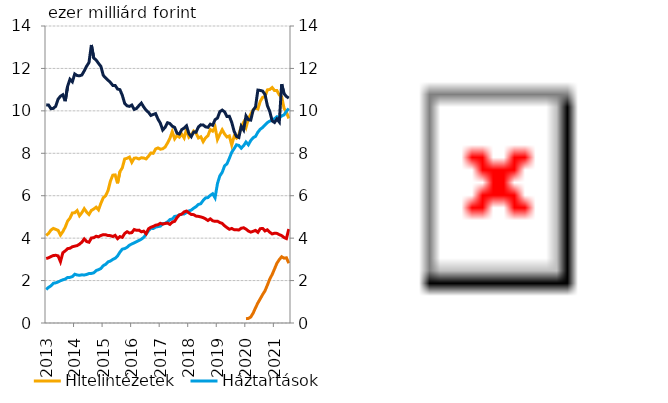
| Category | Hitelintézetek | Háztartások |
|---|---|---|
| 2013-06-30 | 4.122 | 1.58 |
| 2013-07-31 | 4.225 | 1.681 |
| 2013-08-31 | 4.38 | 1.75 |
| 2013-09-30 | 4.46 | 1.872 |
| 2013-10-31 | 4.414 | 1.893 |
| 2013-11-30 | 4.366 | 1.935 |
| 2013-12-31 | 4.145 | 1.991 |
| 2014-01-31 | 4.307 | 2.036 |
| 2014-02-28 | 4.518 | 2.07 |
| 2014-03-31 | 4.802 | 2.148 |
| 2014-04-30 | 4.945 | 2.151 |
| 2014-05-31 | 5.186 | 2.186 |
| 2014-06-30 | 5.196 | 2.301 |
| 2014-07-31 | 5.299 | 2.265 |
| 2014-08-31 | 5.056 | 2.248 |
| 2014-09-30 | 5.198 | 2.27 |
| 2014-10-31 | 5.389 | 2.262 |
| 2014-11-30 | 5.23 | 2.287 |
| 2014-12-31 | 5.116 | 2.333 |
| 2015-01-31 | 5.308 | 2.336 |
| 2015-02-28 | 5.372 | 2.364 |
| 2015-03-31 | 5.46 | 2.472 |
| 2015-04-30 | 5.334 | 2.514 |
| 2015-05-31 | 5.642 | 2.57 |
| 2015-06-30 | 5.904 | 2.704 |
| 2015-07-31 | 6 | 2.766 |
| 2015-08-31 | 6.242 | 2.879 |
| 2015-09-30 | 6.688 | 2.922 |
| 2015-10-31 | 6.969 | 2.995 |
| 2015-11-30 | 6.98 | 3.051 |
| 2015-12-31 | 6.583 | 3.16 |
| 2016-01-31 | 7.134 | 3.34 |
| 2016-02-29 | 7.315 | 3.482 |
| 2016-03-31 | 7.734 | 3.506 |
| 2016-04-30 | 7.763 | 3.568 |
| 2016-05-31 | 7.819 | 3.667 |
| 2016-06-30 | 7.576 | 3.726 |
| 2016-07-31 | 7.771 | 3.779 |
| 2016-08-31 | 7.773 | 3.836 |
| 2016-09-30 | 7.734 | 3.888 |
| 2016-10-31 | 7.79 | 3.95 |
| 2016-11-30 | 7.777 | 4.034 |
| 2016-12-31 | 7.735 | 4.179 |
| 2017-01-31 | 7.861 | 4.344 |
| 2017-02-28 | 8.014 | 4.469 |
| 2017-03-31 | 7.999 | 4.451 |
| 2017-04-30 | 8.201 | 4.52 |
| 2017-05-31 | 8.254 | 4.543 |
| 2017-06-30 | 8.193 | 4.566 |
| 2017-07-31 | 8.214 | 4.683 |
| 2017-08-31 | 8.293 | 4.698 |
| 2017-09-30 | 8.482 | 4.767 |
| 2017-10-31 | 8.702 | 4.874 |
| 2017-11-30 | 9.02 | 4.902 |
| 2017-12-31 | 8.682 | 5.025 |
| 2018-01-31 | 8.841 | 5.04 |
| 2018-02-28 | 8.76 | 5.098 |
| 2018-03-31 | 8.904 | 5.132 |
| 2018-04-30 | 8.723 | 5.14 |
| 2018-05-31 | 9.132 | 5.208 |
| 2018-06-30 | 8.762 | 5.282 |
| 2018-07-31 | 8.862 | 5.324 |
| 2018-08-31 | 9.048 | 5.411 |
| 2018-09-30 | 8.951 | 5.484 |
| 2018-10-31 | 8.722 | 5.588 |
| 2018-11-30 | 8.778 | 5.625 |
| 2018-12-31 | 8.548 | 5.779 |
| 2019-01-31 | 8.728 | 5.898 |
| 2019-02-28 | 8.827 | 5.911 |
| 2019-03-31 | 9.123 | 6.018 |
| 2019-04-30 | 9.044 | 6.092 |
| 2019-05-31 | 9.238 | 5.901 |
| 2019-06-30 | 8.65 | 6.572 |
| 2019-07-31 | 8.894 | 6.935 |
| 2019-08-31 | 9.109 | 7.103 |
| 2019-09-30 | 8.908 | 7.407 |
| 2019-10-31 | 8.767 | 7.503 |
| 2019-11-30 | 8.817 | 7.764 |
| 2019-12-31 | 8.389 | 8.047 |
| 2020-01-31 | 8.798 | 8.217 |
| 2020-02-29 | 8.714 | 8.399 |
| 2020-03-31 | 8.886 | 8.369 |
| 2020-04-30 | 9.26 | 8.241 |
| 2020-05-31 | 9.465 | 8.357 |
| 2020-06-30 | 9.218 | 8.531 |
| 2020-07-31 | 9.62 | 8.4 |
| 2020-08-31 | 9.849 | 8.603 |
| 2020-09-30 | 10.044 | 8.734 |
| 2020-10-31 | 10.141 | 8.796 |
| 2020-11-30 | 10.09 | 8.995 |
| 2020-12-31 | 10.451 | 9.136 |
| 2021-01-31 | 10.638 | 9.216 |
| 2021-02-28 | 10.675 | 9.336 |
| 2021-03-31 | 10.991 | 9.447 |
| 2021-04-30 | 11.008 | 9.517 |
| 2021-05-31 | 11.1 | 9.564 |
| 2021-06-30 | 10.955 | 9.63 |
| 2021-07-31 | 10.956 | 9.723 |
| 2021-08-31 | 10.749 | 9.656 |
| 2021-09-30 | 10.663 | 9.758 |
| 2021-10-31 | 10.122 | 9.811 |
| 2021-11-30 | 9.935 | 9.979 |
| 2021-12-31 | 9.643 | 10.11 |